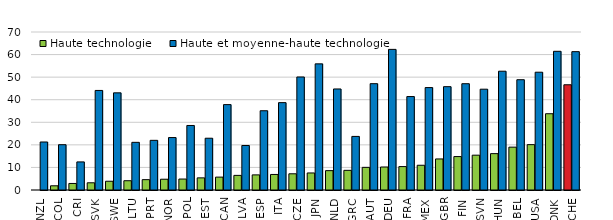
| Category | Haute technologie | Haute et moyenne-haute technologie |
|---|---|---|
| NZL | 0 | 21.269 |
| COL | 1.867 | 20.069 |
| CRI | 2.896 | 12.446 |
| SVK | 3.195 | 44.105 |
| SWE | 3.882 | 43.04 |
| LTU | 4.108 | 21.12 |
| PRT | 4.588 | 22.004 |
| NOR | 4.772 | 23.234 |
| POL | 4.858 | 28.588 |
| EST | 5.378 | 22.935 |
| CAN | 5.705 | 37.829 |
| LVA | 6.475 | 19.718 |
| ESP | 6.7 | 35.113 |
| ITA | 6.887 | 38.705 |
| CZE | 7.183 | 50.077 |
| JPN | 7.551 | 55.879 |
| NLD | 8.577 | 44.762 |
| GRC | 8.709 | 23.744 |
| AUT | 10.027 | 47.106 |
| DEU | 10.188 | 62.302 |
| FRA | 10.37 | 41.398 |
| MEX | 10.959 | 45.377 |
| GBR | 13.761 | 45.785 |
| FIN | 14.809 | 47.092 |
| SVN | 15.424 | 44.659 |
| HUN | 16.111 | 52.627 |
| BEL | 18.984 | 48.86 |
| USA | 20.1 | 52.185 |
| DNK | 33.79 | 61.446 |
| CHE | 46.621 | 61.296 |